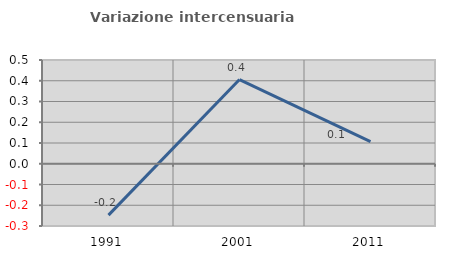
| Category | Variazione intercensuaria annua |
|---|---|
| 1991.0 | -0.248 |
| 2001.0 | 0.406 |
| 2011.0 | 0.107 |